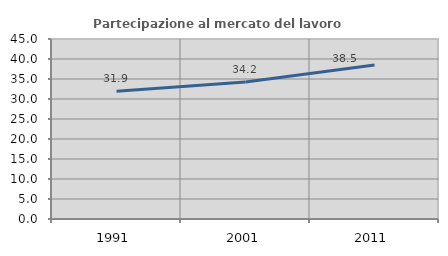
| Category | Partecipazione al mercato del lavoro  femminile |
|---|---|
| 1991.0 | 31.91 |
| 2001.0 | 34.244 |
| 2011.0 | 38.489 |